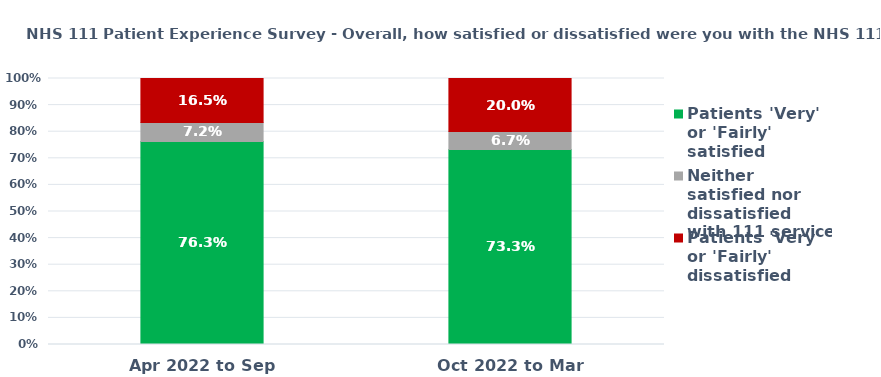
| Category | Patients 'Very' or 'Fairly' satisfied | Neither satisfied nor dissatisfied with 111 service | Patients 'Very' or 'Fairly' dissatisfied |
|---|---|---|---|
| Apr 2022 to Sep 2022 | 0.763 | 0.072 | 0.165 |
| Oct 2022 to Mar 2023 | 0.733 | 0.067 | 0.2 |